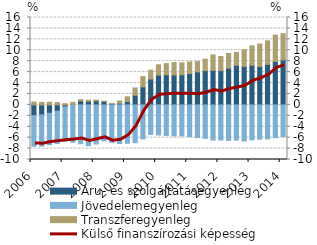
| Category | Áru- és szolgáltatásegyenleg | Jövedelemegyenleg | Transzferegyenleg |
|---|---|---|---|
| 2006.0 | -1.964 | -5.619 | 0.527 |
| 2006.0 | -1.833 | -5.726 | 0.449 |
| 2006.0 | -1.541 | -5.753 | 0.482 |
| 2006.0 | -1.152 | -5.908 | 0.424 |
| 2007.0 | -0.358 | -6.317 | 0.214 |
| 2007.0 | 0.077 | -6.83 | 0.397 |
| 2007.0 | 0.732 | -7.114 | 0.227 |
| 2007.0 | 0.66 | -7.469 | 0.208 |
| 2008.0 | 0.742 | -7.161 | 0.139 |
| 2008.0 | 0.638 | -6.581 | 0.007 |
| 2008.0 | 0.236 | -6.846 | 0.033 |
| 2008.0 | 0.292 | -7.077 | 0.413 |
| 2009.0 | 0.614 | -7.024 | 0.857 |
| 2009.0 | 1.746 | -6.925 | 1.354 |
| 2009.0 | 3.3 | -6.22 | 1.873 |
| 2009.0 | 4.732 | -5.396 | 1.614 |
| 2010.0 | 5.463 | -5.502 | 1.88 |
| 2010.0 | 5.52 | -5.584 | 2.034 |
| 2010.0 | 5.479 | -5.676 | 2.255 |
| 2010.0 | 5.504 | -5.679 | 2.187 |
| 2011.0 | 5.749 | -5.812 | 2.109 |
| 2011.0 | 6.036 | -5.961 | 1.879 |
| 2011.0 | 6.272 | -6.121 | 2.092 |
| 2011.0 | 6.309 | -6.437 | 2.842 |
| 2012.0 | 6.265 | -6.424 | 2.604 |
| 2012.0 | 6.713 | -6.499 | 2.709 |
| 2012.0 | 7.252 | -6.433 | 2.349 |
| 2012.0 | 7.044 | -6.606 | 3.07 |
| 2013.0 | 7.267 | -6.402 | 3.549 |
| 2013.0 | 7.023 | -6.28 | 4.123 |
| 2013.0 | 7.42 | -6.217 | 4.303 |
| 2013.0 | 7.944 | -5.994 | 4.816 |
| 2014.0 | 8.236 | -5.815 | 4.812 |